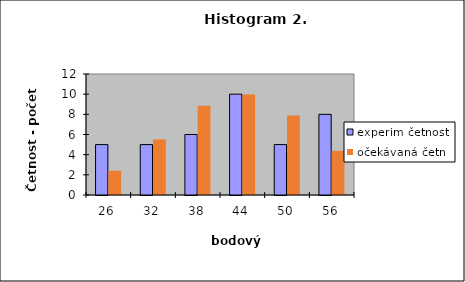
| Category | experim četnost | očekávaná četn |
|---|---|---|
| 26.0 | 5 | 2.404 |
| 32.0 | 5 | 5.508 |
| 38.0 | 6 | 8.85 |
| 44.0 | 10 | 9.976 |
| 50.0 | 5 | 7.888 |
| 56.0 | 8 | 4.375 |